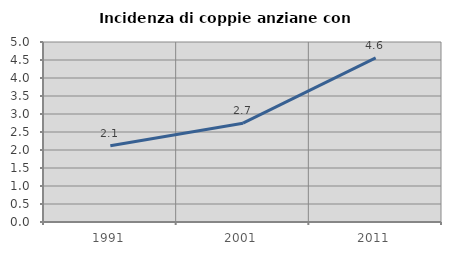
| Category | Incidenza di coppie anziane con figli |
|---|---|
| 1991.0 | 2.118 |
| 2001.0 | 2.744 |
| 2011.0 | 4.56 |